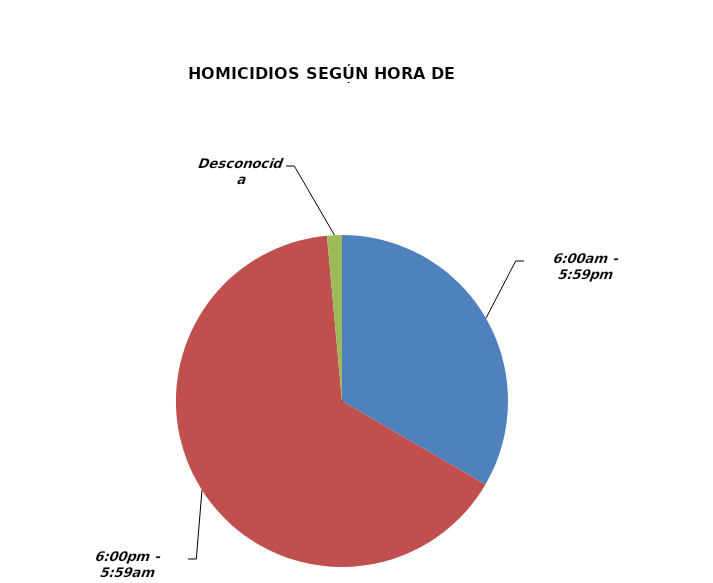
| Category | Series 0 |
|---|---|
| 6:00am - 5:59pm | 185 |
| 6:00pm - 5:59am | 361 |
| Desconocida | 8 |